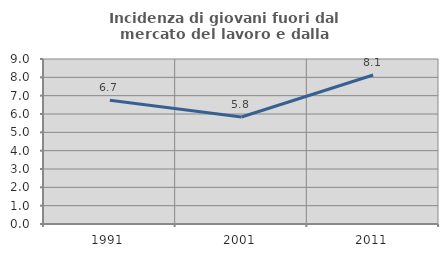
| Category | Incidenza di giovani fuori dal mercato del lavoro e dalla formazione  |
|---|---|
| 1991.0 | 6.744 |
| 2001.0 | 5.838 |
| 2011.0 | 8.126 |